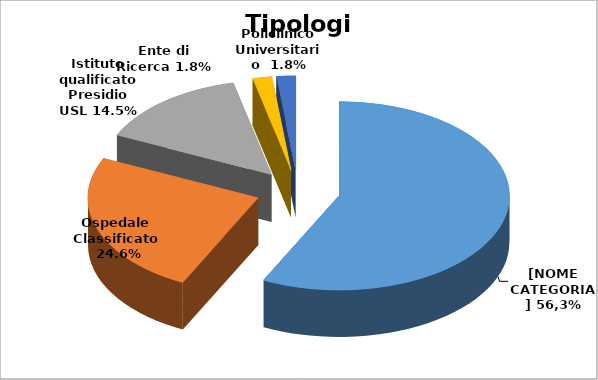
| Category | Series 0 |
|---|---|
| Istituto a carattere scientifico | 0.573 |
| Ospedale Classificato  | 0.246 |
| Istituto qualificato Presidio USL | 0.145 |
| Ente di Ricerca | 0.018 |
| Policlinico Universitario  | 0.018 |